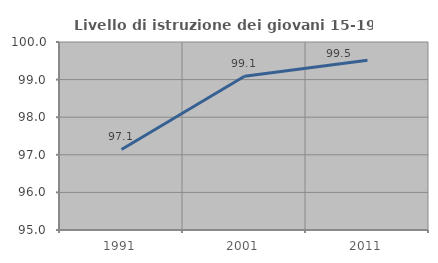
| Category | Livello di istruzione dei giovani 15-19 anni |
|---|---|
| 1991.0 | 97.143 |
| 2001.0 | 99.091 |
| 2011.0 | 99.512 |